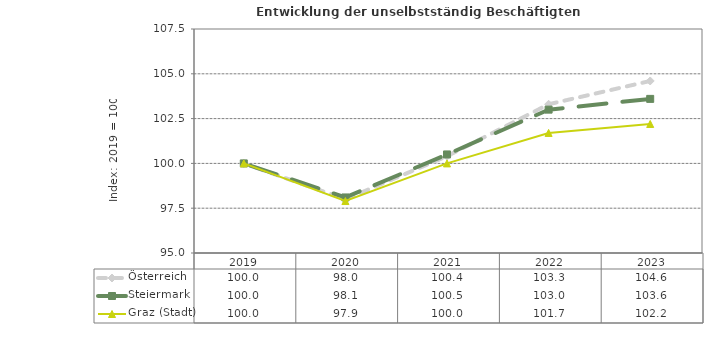
| Category | Österreich | Steiermark | Graz (Stadt) |
|---|---|---|---|
| 2023.0 | 104.6 | 103.6 | 102.2 |
| 2022.0 | 103.3 | 103 | 101.7 |
| 2021.0 | 100.4 | 100.5 | 100 |
| 2020.0 | 98 | 98.1 | 97.9 |
| 2019.0 | 100 | 100 | 100 |